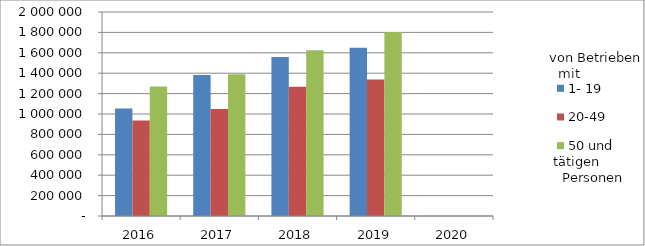
| Category | 1- 19 | 20-49 | 50 und mehr |
|---|---|---|---|
| 2016.0 | 1053714.338 | 935230.073 | 1268825.798 |
| 2017.0 | 1382676.934 | 1049790.605 | 1390739.609 |
| 2018.0 | 1559767.804 | 1267721.312 | 1625033.088 |
| 2019.0 | 1648400.936 | 1337797.111 | 1803544.827 |
| 2020.0 | 0 | 0 | 0 |